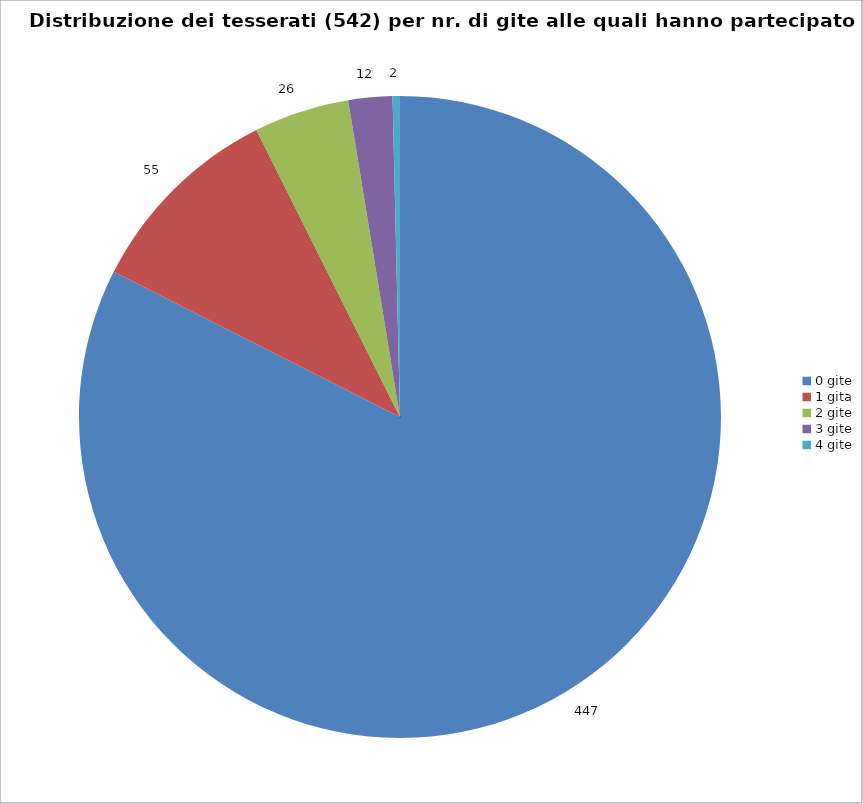
| Category | Nr. Tesserati |
|---|---|
| 0 gite | 447 |
| 1 gita | 55 |
| 2 gite | 26 |
| 3 gite | 12 |
| 4 gite | 2 |